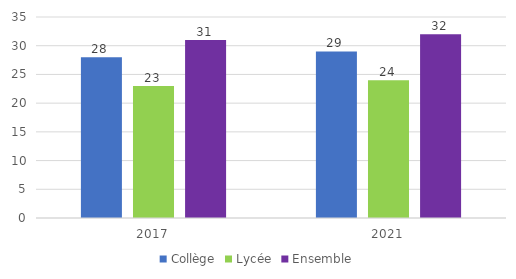
| Category | Collège | Lycée | Ensemble |
|---|---|---|---|
| 2017.0 | 28 | 23 | 31 |
| 2021.0 | 29 | 24 | 32 |